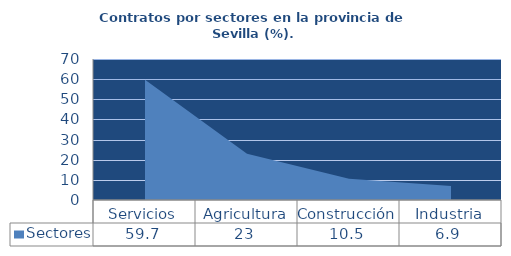
| Category | Sectores |
|---|---|
| Servicios | 59.7 |
| Agricultura | 23 |
| Construcción | 10.5 |
| Industria | 6.9 |